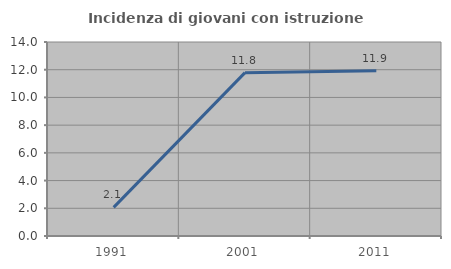
| Category | Incidenza di giovani con istruzione universitaria |
|---|---|
| 1991.0 | 2.066 |
| 2001.0 | 11.787 |
| 2011.0 | 11.917 |